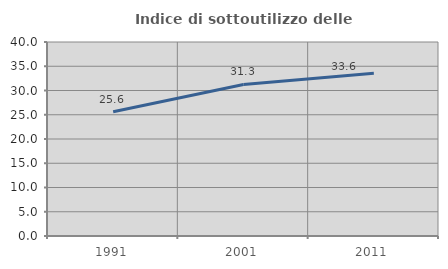
| Category | Indice di sottoutilizzo delle abitazioni  |
|---|---|
| 1991.0 | 25.624 |
| 2001.0 | 31.25 |
| 2011.0 | 33.554 |